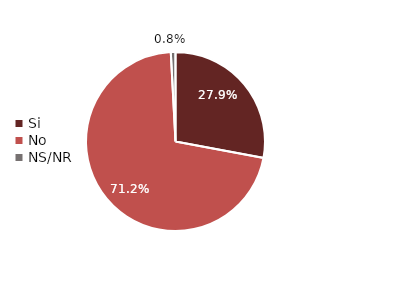
| Category | Series 0 |
|---|---|
| Si | 0.279 |
| No | 0.712 |
| NS/NR | 0.008 |